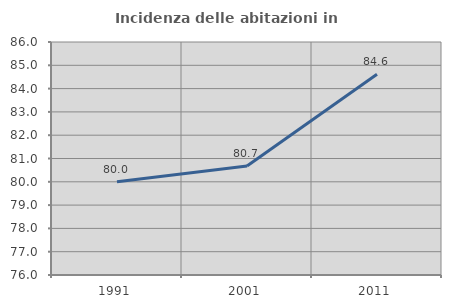
| Category | Incidenza delle abitazioni in proprietà  |
|---|---|
| 1991.0 | 80 |
| 2001.0 | 80.682 |
| 2011.0 | 84.615 |